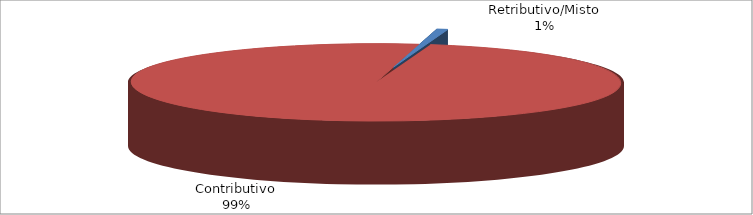
| Category | Decorrenti gennaio - settembre 2020 |
|---|---|
| Retributivo/Misto | 201 |
| Contributivo | 27242 |